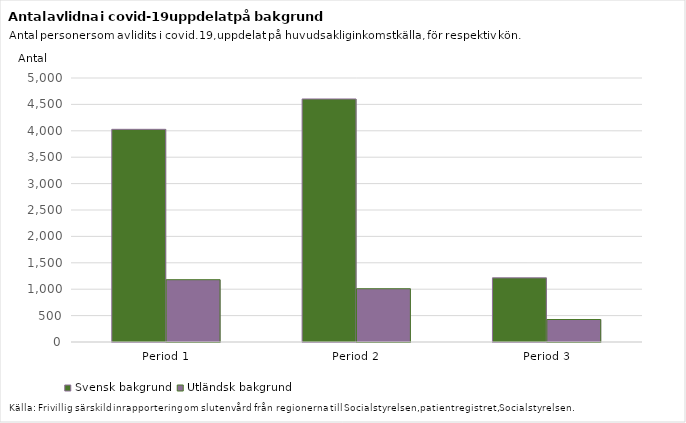
| Category | Svensk bakgrund | Utländsk bakgrund |
|---|---|---|
| Period 1 | 4028 | 1180 |
| Period 2 | 4603 | 1009 |
| Period 3 | 1215 | 426 |